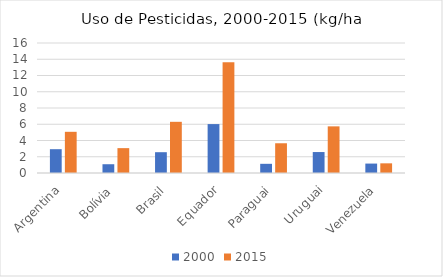
| Category | 2000 | 2015 |
|---|---|---|
| Argentina | 2.93 | 5.07 |
| Bolívia | 1.08 | 3.06 |
| Brasil | 2.56 | 6.3 |
| Equador | 6.02 | 13.64 |
| Paraguai | 1.13 | 3.66 |
| Uruguai | 2.58 | 5.74 |
| Venezuela | 1.16 | 1.19 |